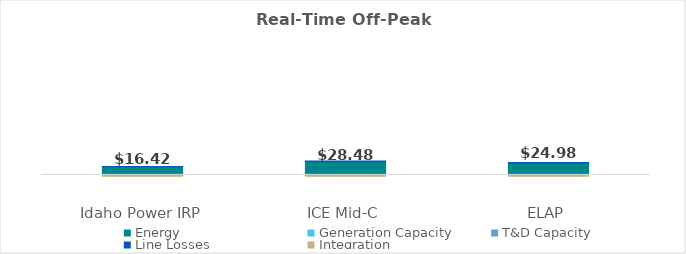
| Category | Energy | Generation Capacity | T&D Capacity | Line Losses | Integration |
|---|---|---|---|---|---|
| 0 | 18.287 | 0 | 0 | 1.061 | -2.93 |
| 1 | 29.684 | 0 | 0 | 1.722 | -2.93 |
| 2 | 26.377 | 0 | 0 | 1.53 | -2.93 |